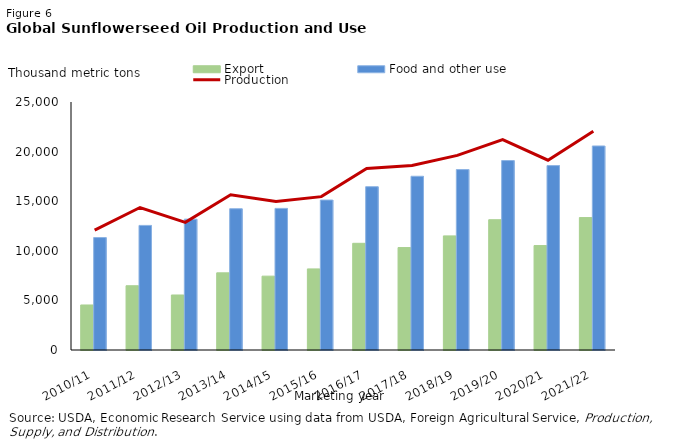
| Category | Export | Food and other use |
|---|---|---|
| 2010/11 | 4538 | 11335 |
| 2011/12 | 6478 | 12559 |
| 2012/13 | 5545 | 13192 |
| 2013/14 | 7777 | 14242 |
| 2014/15 | 7444 | 14275 |
| 2015/16 | 8176 | 15117 |
| 2016/17 | 10755 | 16462 |
| 2017/18 | 10327 | 17514 |
| 2018/19 | 11503 | 18189 |
| 2019/20 | 13132 | 19097 |
| 2020/21 | 10527 | 18589 |
| 2021/22 | 13349 | 20567 |